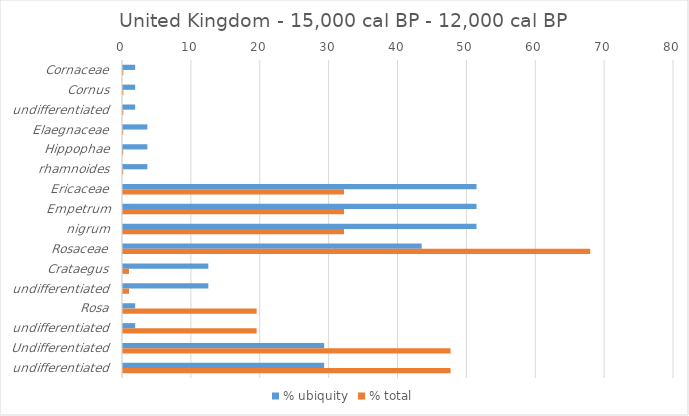
| Category | % ubiquity | % total |
|---|---|---|
| Cornaceae | 1.77 | 0.045 |
| Cornus | 1.77 | 0.045 |
| undifferentiated | 1.77 | 0.045 |
| Elaegnaceae | 3.54 | 0.034 |
| Hippophae | 3.54 | 0.034 |
| rhamnoides | 3.54 | 0.034 |
| Ericaceae | 51.327 | 32.089 |
| Empetrum | 51.327 | 32.089 |
| nigrum | 51.327 | 32.089 |
| Rosaceae | 43.363 | 67.832 |
| Crataegus | 12.389 | 0.871 |
| undifferentiated | 12.389 | 0.871 |
| Rosa | 1.77 | 19.402 |
| undifferentiated | 1.77 | 19.402 |
| Undifferentiated | 29.204 | 47.559 |
| undifferentiated | 29.204 | 47.559 |